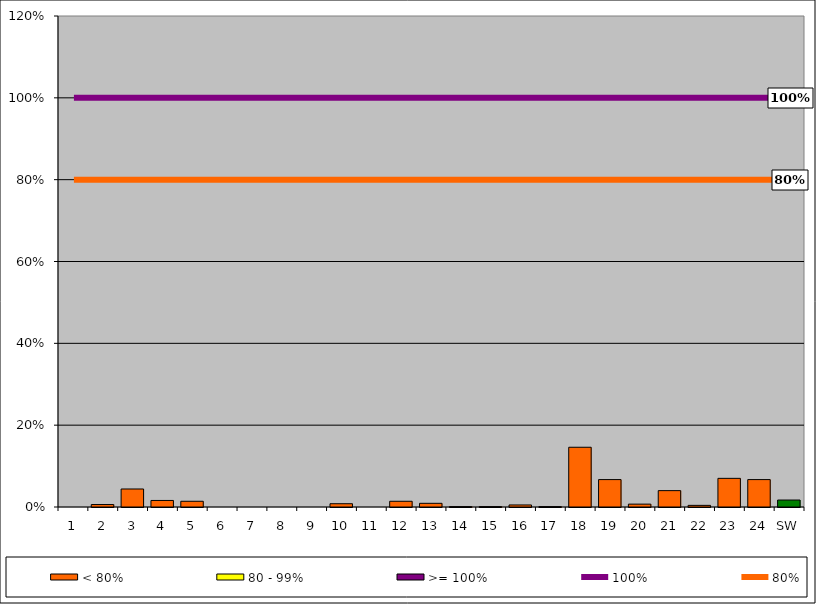
| Category | < 80% | 80 - 99% | >= 100% |
|---|---|---|---|
| 1 | 0 | 0 | 0 |
| 2 | 0.006 | 0 | 0 |
| 3 | 0.044 | 0 | 0 |
| 4 | 0.016 | 0 | 0 |
| 5 | 0.014 | 0 | 0 |
| 6 | 0 | 0 | 0 |
| 7 | 0 | 0 | 0 |
| 8 | 0 | 0 | 0 |
| 9 | 0 | 0 | 0 |
| 10 | 0.008 | 0 | 0 |
| 11 | 0 | 0 | 0 |
| 12 | 0.014 | 0 | 0 |
| 13 | 0.009 | 0 | 0 |
| 14 | 0.001 | 0 | 0 |
| 15 | 0.001 | 0 | 0 |
| 16 | 0.005 | 0 | 0 |
| 17 | 0.001 | 0 | 0 |
| 18 | 0.146 | 0 | 0 |
| 19 | 0.067 | 0 | 0 |
| 20 | 0.007 | 0 | 0 |
| 21 | 0.04 | 0 | 0 |
| 22 | 0.004 | 0 | 0 |
| 23 | 0.07 | 0 | 0 |
| 24 | 0.067 | 0 | 0 |
| SW | 0.017 | 0 | 0 |